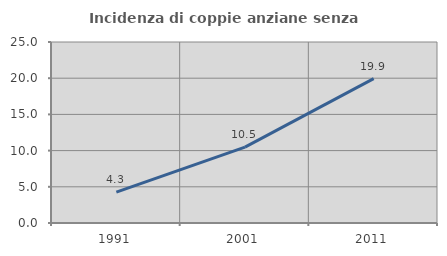
| Category | Incidenza di coppie anziane senza figli  |
|---|---|
| 1991.0 | 4.259 |
| 2001.0 | 10.474 |
| 2011.0 | 19.95 |